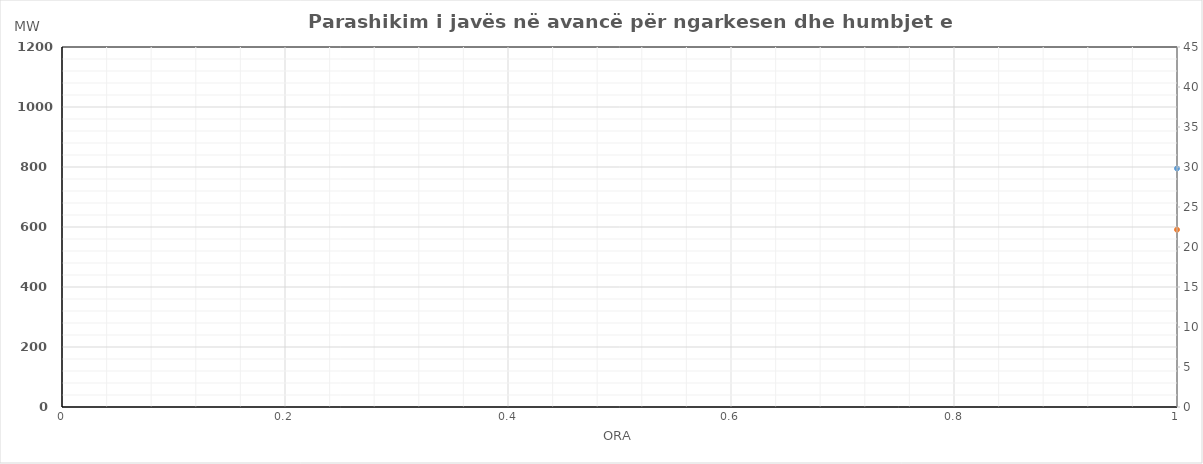
| Category | Ngarkesa (MWh) |
|---|---|
| 0 | 590.896 |
| 1 | 545.11 |
| 2 | 526.28 |
| 3 | 518.579 |
| 4 | 522.72 |
| 5 | 559.515 |
| 6 | 613.478 |
| 7 | 735.655 |
| 8 | 846.372 |
| 9 | 894.819 |
| 10 | 901.367 |
| 11 | 903.041 |
| 12 | 897.7 |
| 13 | 889.861 |
| 14 | 861.619 |
| 15 | 822.602 |
| 16 | 815.993 |
| 17 | 829.059 |
| 18 | 856.203 |
| 19 | 905.067 |
| 20 | 985.321 |
| 21 | 928.162 |
| 22 | 844.687 |
| 23 | 720.326 |
| 24 | 616.96 |
| 25 | 567.493 |
| 26 | 545.098 |
| 27 | 536.892 |
| 28 | 544.764 |
| 29 | 591.591 |
| 30 | 627.334 |
| 31 | 726.23 |
| 32 | 827.917 |
| 33 | 899.306 |
| 34 | 951.812 |
| 35 | 963.674 |
| 36 | 931.748 |
| 37 | 862.362 |
| 38 | 800.069 |
| 39 | 757.919 |
| 40 | 756.807 |
| 41 | 783.111 |
| 42 | 815.721 |
| 43 | 861.344 |
| 44 | 905.982 |
| 45 | 843.601 |
| 46 | 786.743 |
| 47 | 691.771 |
| 48 | 595.739 |
| 49 | 549.128 |
| 50 | 542.193 |
| 51 | 555.128 |
| 52 | 543.971 |
| 53 | 562.322 |
| 54 | 622.075 |
| 55 | 728.517 |
| 56 | 817.697 |
| 57 | 870.753 |
| 58 | 875.624 |
| 59 | 872.18 |
| 60 | 871.213 |
| 61 | 849.338 |
| 62 | 811.326 |
| 63 | 802.462 |
| 64 | 820.493 |
| 65 | 841.057 |
| 66 | 877.418 |
| 67 | 937.303 |
| 68 | 955.958 |
| 69 | 892.195 |
| 70 | 802.227 |
| 71 | 693.896 |
| 72 | 612.96 |
| 73 | 563.493 |
| 74 | 541.098 |
| 75 | 532.892 |
| 76 | 540.764 |
| 77 | 587.591 |
| 78 | 623.334 |
| 79 | 722.23 |
| 80 | 823.917 |
| 81 | 895.306 |
| 82 | 947.812 |
| 83 | 959.674 |
| 84 | 927.748 |
| 85 | 858.362 |
| 86 | 796.069 |
| 87 | 753.919 |
| 88 | 752.807 |
| 89 | 779.111 |
| 90 | 811.721 |
| 91 | 857.344 |
| 92 | 901.982 |
| 93 | 839.601 |
| 94 | 782.743 |
| 95 | 687.771 |
| 96 | 590.739 |
| 97 | 544.128 |
| 98 | 537.193 |
| 99 | 550.128 |
| 100 | 538.971 |
| 101 | 557.322 |
| 102 | 617.075 |
| 103 | 723.517 |
| 104 | 812.697 |
| 105 | 865.753 |
| 106 | 870.624 |
| 107 | 867.18 |
| 108 | 866.213 |
| 109 | 844.338 |
| 110 | 806.326 |
| 111 | 797.462 |
| 112 | 815.493 |
| 113 | 836.057 |
| 114 | 872.418 |
| 115 | 932.303 |
| 116 | 950.958 |
| 117 | 887.195 |
| 118 | 797.227 |
| 119 | 688.896 |
| 120 | 610.96 |
| 121 | 561.493 |
| 122 | 539.098 |
| 123 | 530.892 |
| 124 | 538.764 |
| 125 | 585.591 |
| 126 | 621.334 |
| 127 | 720.23 |
| 128 | 821.917 |
| 129 | 893.306 |
| 130 | 945.812 |
| 131 | 957.674 |
| 132 | 925.748 |
| 133 | 856.362 |
| 134 | 794.069 |
| 135 | 751.919 |
| 136 | 750.807 |
| 137 | 777.111 |
| 138 | 809.721 |
| 139 | 855.344 |
| 140 | 899.982 |
| 141 | 837.601 |
| 142 | 780.743 |
| 143 | 685.771 |
| 144 | 588.739 |
| 145 | 542.128 |
| 146 | 535.193 |
| 147 | 548.128 |
| 148 | 536.971 |
| 149 | 555.322 |
| 150 | 615.075 |
| 151 | 721.517 |
| 152 | 810.697 |
| 153 | 863.753 |
| 154 | 868.624 |
| 155 | 865.18 |
| 156 | 864.213 |
| 157 | 842.338 |
| 158 | 804.326 |
| 159 | 795.462 |
| 160 | 813.493 |
| 161 | 834.057 |
| 162 | 870.418 |
| 163 | 930.303 |
| 164 | 948.958 |
| 165 | 885.195 |
| 166 | 795.227 |
| 167 | 686.896 |